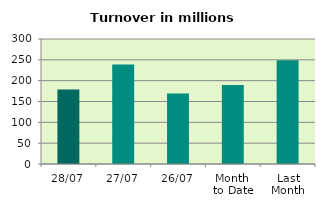
| Category | Series 0 |
|---|---|
| 28/07 | 178.918 |
| 27/07 | 238.938 |
| 26/07 | 169.494 |
| Month 
to Date | 189.897 |
| Last
Month | 248.976 |